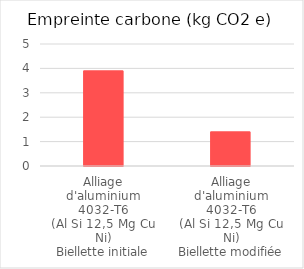
| Category | Series 0 |
|---|---|
| Alliage
d'aluminium
4032-T6
(Al Si 12,5 Mg Cu Ni)
Biellette initiale | 3.9 |
| Alliage
d'aluminium
4032-T6
(Al Si 12,5 Mg Cu Ni)
Biellette modifiée | 1.4 |